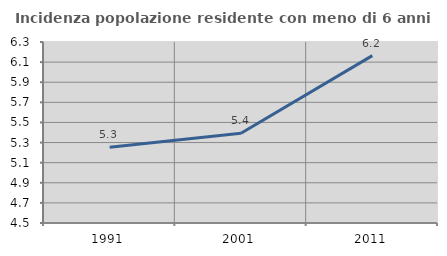
| Category | Incidenza popolazione residente con meno di 6 anni |
|---|---|
| 1991.0 | 5.252 |
| 2001.0 | 5.392 |
| 2011.0 | 6.164 |